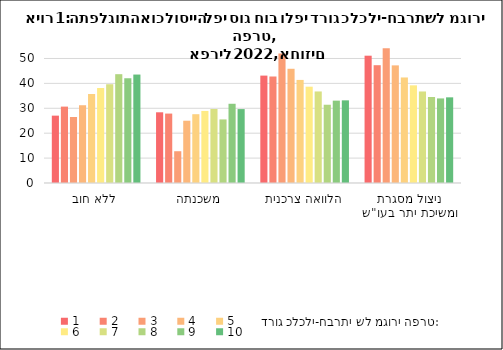
| Category | 1 | 2 | 3 | 4 | 5 | 6 | 7 | 8 | 9 | 10 |
|---|---|---|---|---|---|---|---|---|---|---|
| ללא חוב | 27.045 | 30.671 | 26.493 | 31.216 | 35.74 | 38.132 | 39.649 | 43.684 | 42.048 | 43.537 |
| משכנתה | 28.385 | 27.872 | 12.754 | 25.005 | 27.616 | 28.94 | 29.701 | 25.522 | 31.812 | 29.669 |
| הלוואה צרכנית | 43.114 | 42.755 | 52.034 | 45.86 | 41.386 | 38.662 | 36.749 | 31.425 | 33.061 | 33.181 |
| ניצול מסגרת ומשיכת יתר בעו"ש | 51.106 | 47.29 | 54.082 | 47.224 | 42.367 | 39.203 | 36.777 | 34.563 | 33.958 | 34.389 |